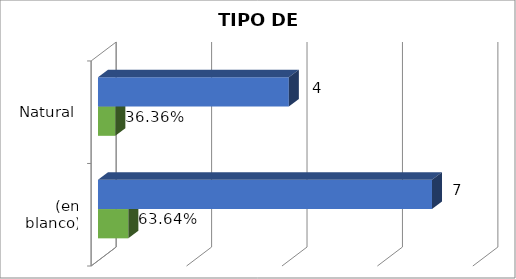
| Category | Cuenta de Número petición2 | Cuenta de Número petición |
|---|---|---|
| (en blanco) | 0.636 | 7 |
| Natural | 0.364 | 4 |